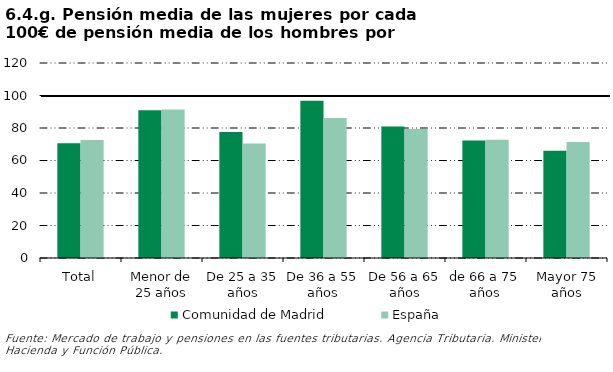
| Category | Comunidad de Madrid | España |
|---|---|---|
| Total | 70.664 | 72.662 |
| Menor de 25 años | 90.925 | 91.376 |
| De 25 a 35 años | 77.462 | 70.481 |
| De 36 a 55 años | 96.747 | 86.089 |
| De 56 a 65 años | 80.9 | 79.437 |
| de 66 a 75 años | 72.243 | 72.701 |
| Mayor 75 años | 66.041 | 71.343 |